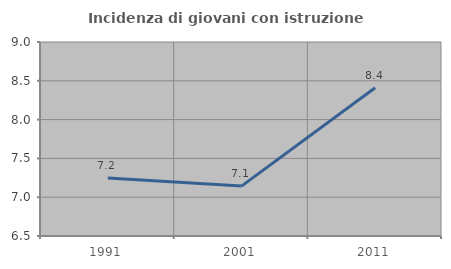
| Category | Incidenza di giovani con istruzione universitaria |
|---|---|
| 1991.0 | 7.246 |
| 2001.0 | 7.143 |
| 2011.0 | 8.411 |